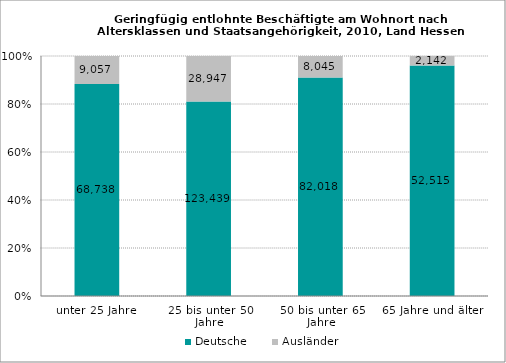
| Category | Deutsche | Ausländer |
|---|---|---|
| unter 25 Jahre | 68738 | 9057 |
| 25 bis unter 50 Jahre | 123439 | 28947 |
| 50 bis unter 65 Jahre | 82018 | 8045 |
| 65 Jahre und älter | 52515 | 2142 |